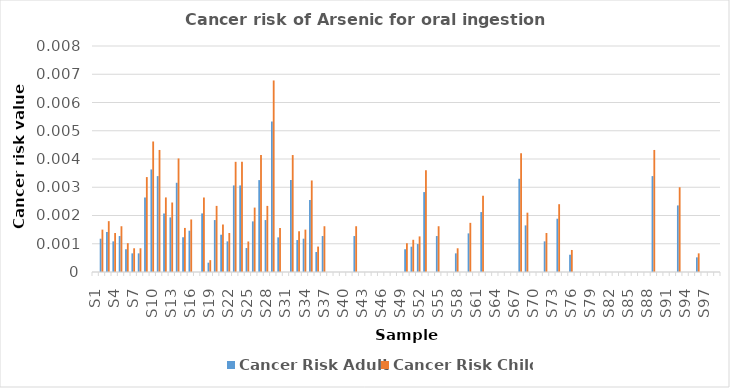
| Category | Cancer Risk Adult | Cancer Risk Child |
|---|---|---|
| S1 | 0 | 0 |
| S2 | 0.001 | 0.002 |
| S3 | 0.001 | 0.002 |
| S4 | 0.001 | 0.001 |
| S5 | 0.001 | 0.002 |
| S6 | 0.001 | 0.001 |
| S7 | 0.001 | 0.001 |
| S8 | 0.001 | 0.001 |
| S9 | 0.003 | 0.003 |
| S10 | 0.004 | 0.005 |
| S11 | 0.003 | 0.004 |
| S12 | 0.002 | 0.003 |
| S13 | 0.002 | 0.002 |
| S14 | 0.003 | 0.004 |
| S15 | 0.001 | 0.002 |
| S16 | 0.001 | 0.002 |
| S17 | 0 | 0 |
| S18 | 0.002 | 0.003 |
| S19 | 0 | 0 |
| S20 | 0.002 | 0.002 |
| S21 | 0.001 | 0.002 |
| S22 | 0.001 | 0.001 |
| S23 | 0.003 | 0.004 |
| S24 | 0.003 | 0.004 |
| S25 | 0.001 | 0.001 |
| S26 | 0.002 | 0.002 |
| S27 | 0.003 | 0.004 |
| S28 | 0.002 | 0.002 |
| S29 | 0.005 | 0.007 |
| S30 | 0.001 | 0.002 |
| S31 | 0 | 0 |
| S32 | 0.003 | 0.004 |
| S33 | 0.001 | 0.001 |
| S34 | 0.001 | 0.002 |
| S35 | 0.003 | 0.003 |
| S36 | 0.001 | 0.001 |
| S37 | 0.001 | 0.002 |
| S38 | 0 | 0 |
| S39 | 0 | 0 |
| S40 | 0 | 0 |
| S41 | 0 | 0 |
| S42 | 0.001 | 0.002 |
| S43 | 0 | 0 |
| S44 | 0 | 0 |
| S45 | 0 | 0 |
| S46 | 0 | 0 |
| S47 | 0 | 0 |
| S48 | 0 | 0 |
| S49 | 0 | 0 |
| S50 | 0.001 | 0.001 |
| S51 | 0.001 | 0.001 |
| S52 | 0.001 | 0.001 |
| S53 | 0.003 | 0.004 |
| S54 | 0 | 0 |
| S55 | 0.001 | 0.002 |
| S56 | 0 | 0 |
| S57 | 0 | 0 |
| S58 | 0.001 | 0.001 |
| S59 | 0 | 0 |
| S60 | 0.001 | 0.002 |
| S61 | 0 | 0 |
| S62 | 0.002 | 0.003 |
| S63 | 0 | 0 |
| S64 | 0 | 0 |
| S65 | 0 | 0 |
| S66 | 0 | 0 |
| S67 | 0 | 0 |
| S68 | 0.003 | 0.004 |
| S69 | 0.002 | 0.002 |
| S70 | 0 | 0 |
| S71 | 0 | 0 |
| S72 | 0.001 | 0.001 |
| S73 | 0 | 0 |
| S74 | 0.002 | 0.002 |
| S75 | 0 | 0 |
| S76 | 0.001 | 0.001 |
| S77 | 0 | 0 |
| S78 | 0 | 0 |
| S79 | 0 | 0 |
| S80 | 0 | 0 |
| S81 | 0 | 0 |
| S82 | 0 | 0 |
| S83 | 0 | 0 |
| S84 | 0 | 0 |
| S85 | 0 | 0 |
| S86 | 0 | 0 |
| S87 | 0 | 0 |
| S88 | 0 | 0 |
| S89 | 0.003 | 0.004 |
| S90 | 0 | 0 |
| S91 | 0 | 0 |
| S92 | 0 | 0 |
| S93 | 0.002 | 0.003 |
| S94 | 0 | 0 |
| S95 | 0 | 0 |
| S96 | 0.001 | 0.001 |
| S97 | 0 | 0 |
| S98 | 0 | 0 |
| S99 | 0 | 0 |